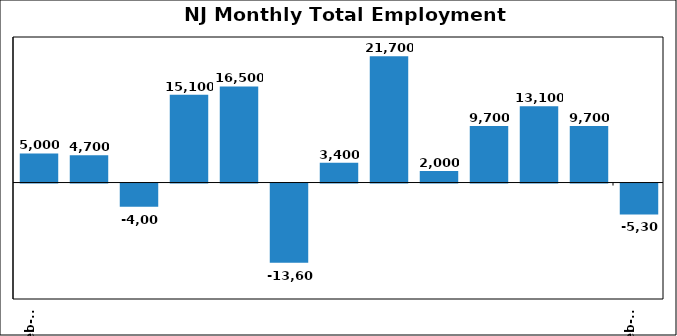
| Category | Series 0 |
|---|---|
| 2023-02-12 | 5000 |
| 2023-03-12 | 4700 |
| 2023-04-12 | -4000 |
| 2023-05-12 | 15100 |
| 2023-06-12 | 16500 |
| 2023-07-12 | -13600 |
| 2023-08-12 | 3400 |
| 2023-09-12 | 21700 |
| 2023-10-12 | 2000 |
| 2023-11-12 | 9700 |
| 2023-12-12 | 13100 |
| 2024-01-12 | 9700 |
| 2024-02-12 | -5300 |